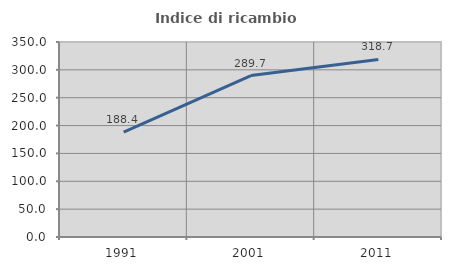
| Category | Indice di ricambio occupazionale  |
|---|---|
| 1991.0 | 188.372 |
| 2001.0 | 289.744 |
| 2011.0 | 318.667 |